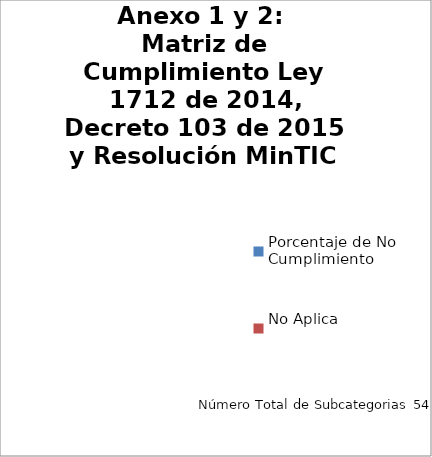
| Category | Anexo 1 y 2: 
Matriz de Cumplimiento Ley 1712 de 2014, Decreto 103 de 2015 y Resolución MinTIC 3564 de 2015 |
|---|---|
| Porcentaje de No Cumplimiento | 0 |
| No Aplica | 0 |